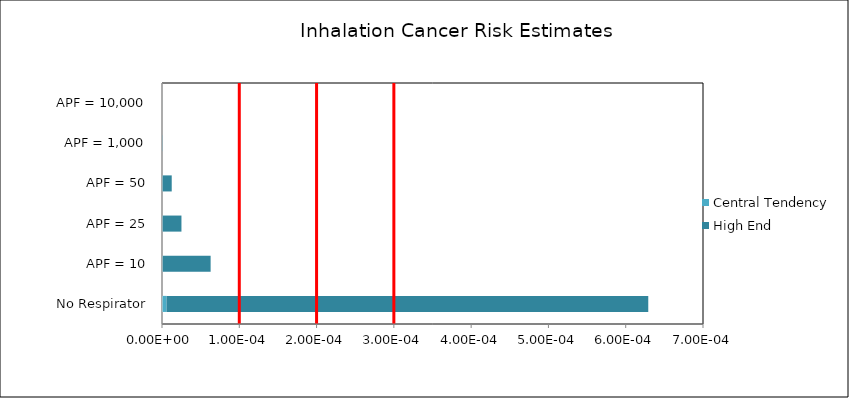
| Category | Central Tendency | High End |
|---|---|---|
| No Respirator | 0 | 0.001 |
| APF = 10 | 0 | 0 |
| APF = 25 | 0 | 0 |
| APF = 50 | 0 | 0 |
| APF = 1,000 | 0 | 0 |
| APF = 10,000 | 0 | 0 |